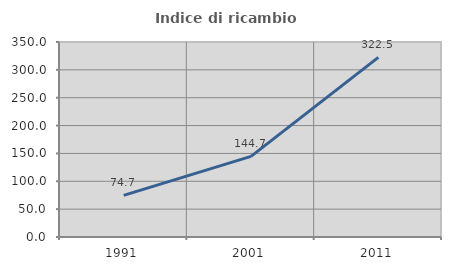
| Category | Indice di ricambio occupazionale  |
|---|---|
| 1991.0 | 74.747 |
| 2001.0 | 144.672 |
| 2011.0 | 322.513 |